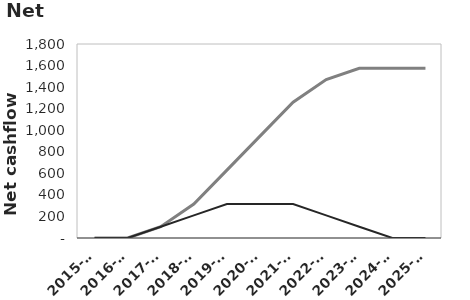
| Category | Series 2 | Series 0 |
|---|---|---|
| 2015-16 | 0 | 0 |
| 2016-17 | 0 | 0 |
| 2017-18 | 105 | 105 |
| 2018-19 | 315 | 210 |
| 2019-20 | 630 | 315 |
| 2020-21 | 945 | 315 |
| 2021-22 | 1260 | 315 |
| 2022-23 | 1470 | 210 |
| 2023-24 | 1575 | 105 |
| 2024-25 | 1575 | 0 |
| 2025-26 | 1575 | 0 |